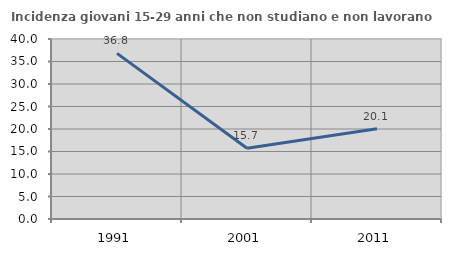
| Category | Incidenza giovani 15-29 anni che non studiano e non lavorano  |
|---|---|
| 1991.0 | 36.809 |
| 2001.0 | 15.726 |
| 2011.0 | 20.075 |